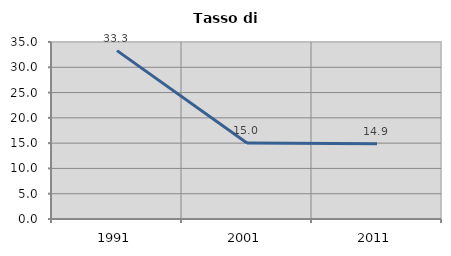
| Category | Tasso di disoccupazione   |
|---|---|
| 1991.0 | 33.291 |
| 2001.0 | 15.015 |
| 2011.0 | 14.9 |